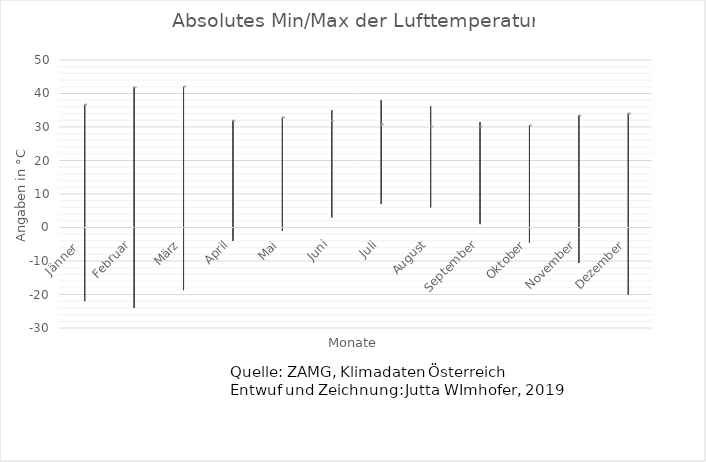
| Category | Absolutes monatliches Minimum | Absolutes monatliches Maximum  | Spannweite  |
|---|---|---|---|
| Jänner  | -22 | 14.8 | 36.8 |
| Februar | -24 | 18 | 42 |
| März | -18.7 | 23.5 | 42.2 |
| April | -4 | 28 | 32 |
| Mai | -1 | 32 | 33 |
| Juni | 3 | 35 | 32 |
| Juli | 7 | 38 | 31 |
| August | 6 | 36.2 | 30.2 |
| September | 1 | 31.4 | 30.4 |
| Oktober | -4.5 | 26 | 30.5 |
| November | -10.6 | 23 | 33.6 |
| Dezember | -20 | 14.2 | 34.2 |